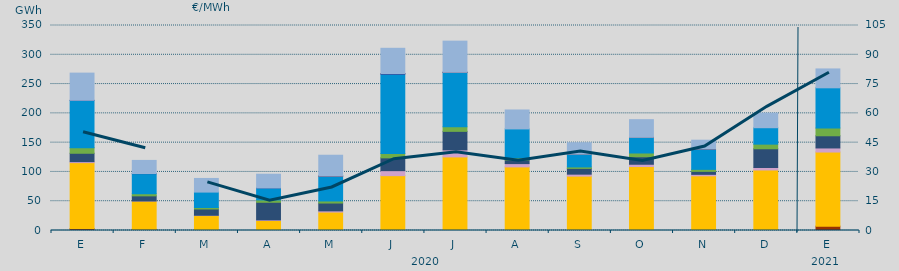
| Category | Carbón | Ciclo Combinado | Cogeneración | Consumo Bombeo | Eólica | Hidráulica | Nuclear | Solar fotovoltaica | Turbinación bombeo |
|---|---|---|---|---|---|---|---|---|---|
| E | 3376.2 | 112471.6 | 1718.3 | 14293.3 | 9539.1 | 80742.1 | 186 | 0 | 46371.3 |
| F | 1995 | 48257.3 | 169 | 8732.4 | 3606.8 | 34283.3 | 267 | 0 | 22347.8 |
| M | 418.1 | 25069.8 | 511.6 | 10680.8 | 2598.7 | 26299.3 | 0 | 0 | 23301.1 |
| A | 0 | 17020 | 1099 | 30032 | 4029 | 20482 | 12 | 0 | 23437 |
| M | 5 | 31454.1 | 2074.9 | 13342 | 3540.5 | 42478.4 | 139 | 1 | 35473.1 |
| J | 105 | 93533.6 | 8541.6 | 21857.1 | 7292.6 | 135598.7 | 1073 | 2 | 43074.4 |
| J | 50 | 125585.6 | 12039 | 31594.3 | 7693.1 | 93034.8 | 70 | 4 | 53243.2 |
| A | 0 | 108564.2 | 5645 | 6241.6 | 3597 | 49376 | 0 | 0 | 32334.2 |
| S | 50 | 92799.2 | 3342.1 | 9830.5 | 2500.3 | 21849.9 | 0 | 1 | 19451 |
| O | 3 | 109185.7 | 3918.6 | 12821.2 | 6372.3 | 26600.6 | 125 | 8 | 30188 |
| N | 213 | 93098.7 | 2563.1 | 5075 | 3418.9 | 34861.3 | 44 | 1 | 14918.7 |
| D | 262 | 103017.6 | 4284.9 | 31984.7 | 7901.9 | 28032.3 | 0 | 0 | 24956.6 |
| E | 7444 | 126506.9 | 6978.7 | 20802.6 | 13159.6 | 68727.9 | 0 | 0 | 32220.5 |